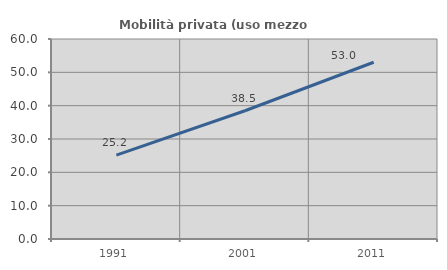
| Category | Mobilità privata (uso mezzo privato) |
|---|---|
| 1991.0 | 25.153 |
| 2001.0 | 38.47 |
| 2011.0 | 53.029 |